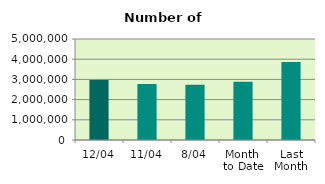
| Category | Series 0 |
|---|---|
| 12/04 | 2971670 |
| 11/04 | 2774362 |
| 8/04 | 2733182 |
| Month 
to Date | 2880917 |
| Last
Month | 3862771.739 |